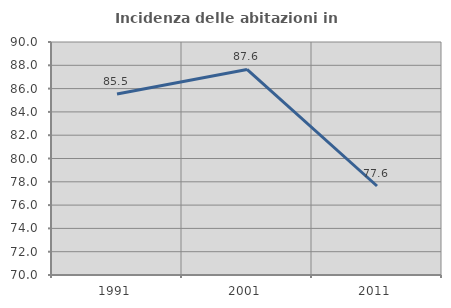
| Category | Incidenza delle abitazioni in proprietà  |
|---|---|
| 1991.0 | 85.537 |
| 2001.0 | 87.64 |
| 2011.0 | 77.64 |